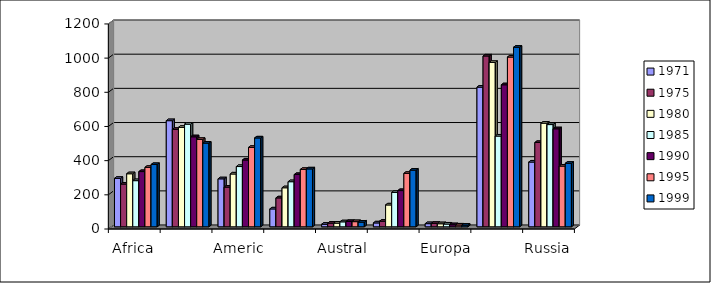
| Category | 1971 | 1975 | 1980 | 1985 | 1990 | 1995 | 1999 |
|---|---|---|---|---|---|---|---|
| Africa | 283.4 | 250 | 310.4 | 270 | 323.1 | 347.7 | 364.4 |
| America del Nord | 621 | 570.1 | 581.9 | 600.6 | 526.7 | 511.3 | 489.7 |
| America Latina | 280.7 | 232.2 | 309.1 | 352.6 | 390.8 | 464.6 | 519.9 |
| Asia | 104.5 | 169.2 | 228.4 | 263.9 | 305.9 | 335.7 | 338.7 |
| Australasia | 14.8 | 21.2 | 21.6 | 29.1 | 30.9 | 30.2 | 27.3 |
| Europa OCSE | 22.7 | 32.6 | 127.9 | 201 | 211.9 | 312.5 | 331.4 |
| Europa non OCSE | 18.4 | 19.9 | 17.8 | 16 | 12.1 | 10.3 | 9.2 |
| Medio Oriente | 817.2 | 999.6 | 961.7 | 531 | 831 | 993.4 | 1050.6 |
| Russia | 378.9 | 493.2 | 606.1 | 598.2 | 573.5 | 355.3 | 371.6 |